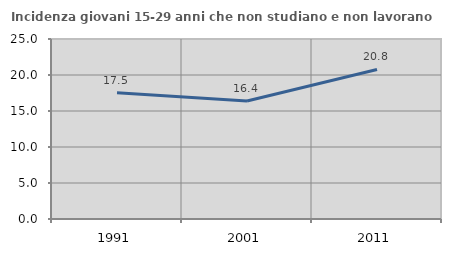
| Category | Incidenza giovani 15-29 anni che non studiano e non lavorano  |
|---|---|
| 1991.0 | 17.523 |
| 2001.0 | 16.4 |
| 2011.0 | 20.765 |